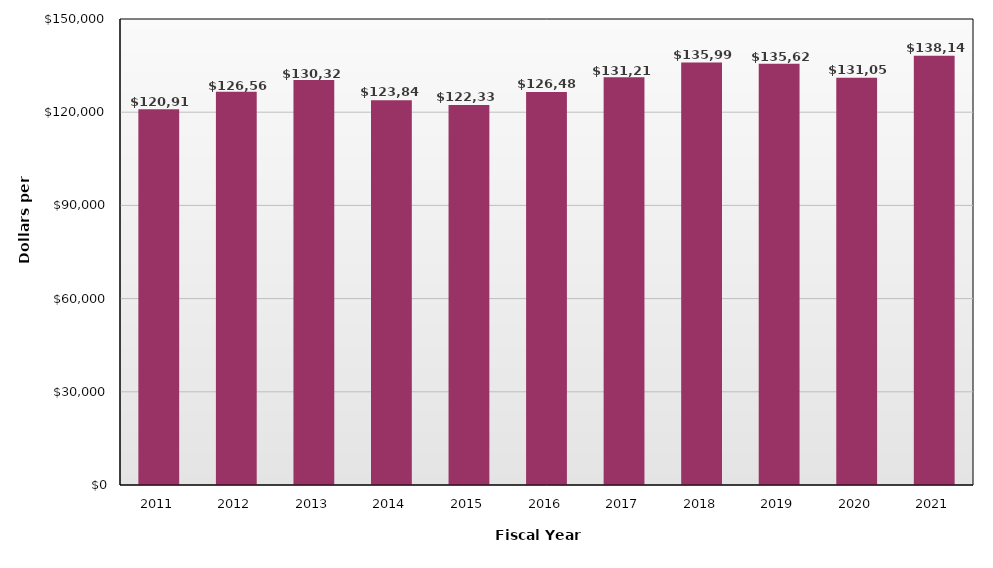
| Category | Total Revenue |
|---|---|
| 2011.0 | 120916 |
| 2012.0 | 126566 |
| 2013.0 | 130329 |
| 2014.0 | 123845 |
| 2015.0 | 122332 |
| 2016.0 | 126489 |
| 2017.0 | 131211 |
| 2018.0 | 135995 |
| 2019.0 | 135628 |
| 2020.0 | 131050 |
| 2021.0 | 138147 |